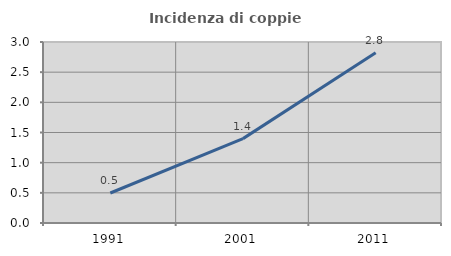
| Category | Incidenza di coppie miste |
|---|---|
| 1991.0 | 0.497 |
| 2001.0 | 1.398 |
| 2011.0 | 2.82 |